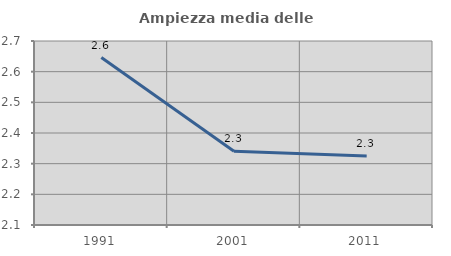
| Category | Ampiezza media delle famiglie |
|---|---|
| 1991.0 | 2.646 |
| 2001.0 | 2.34 |
| 2011.0 | 2.325 |